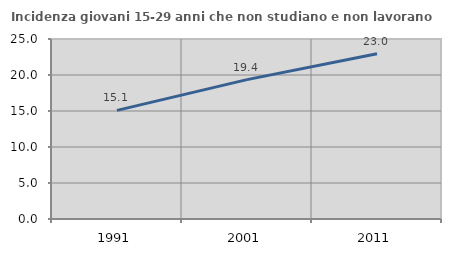
| Category | Incidenza giovani 15-29 anni che non studiano e non lavorano  |
|---|---|
| 1991.0 | 15.087 |
| 2001.0 | 19.355 |
| 2011.0 | 22.951 |